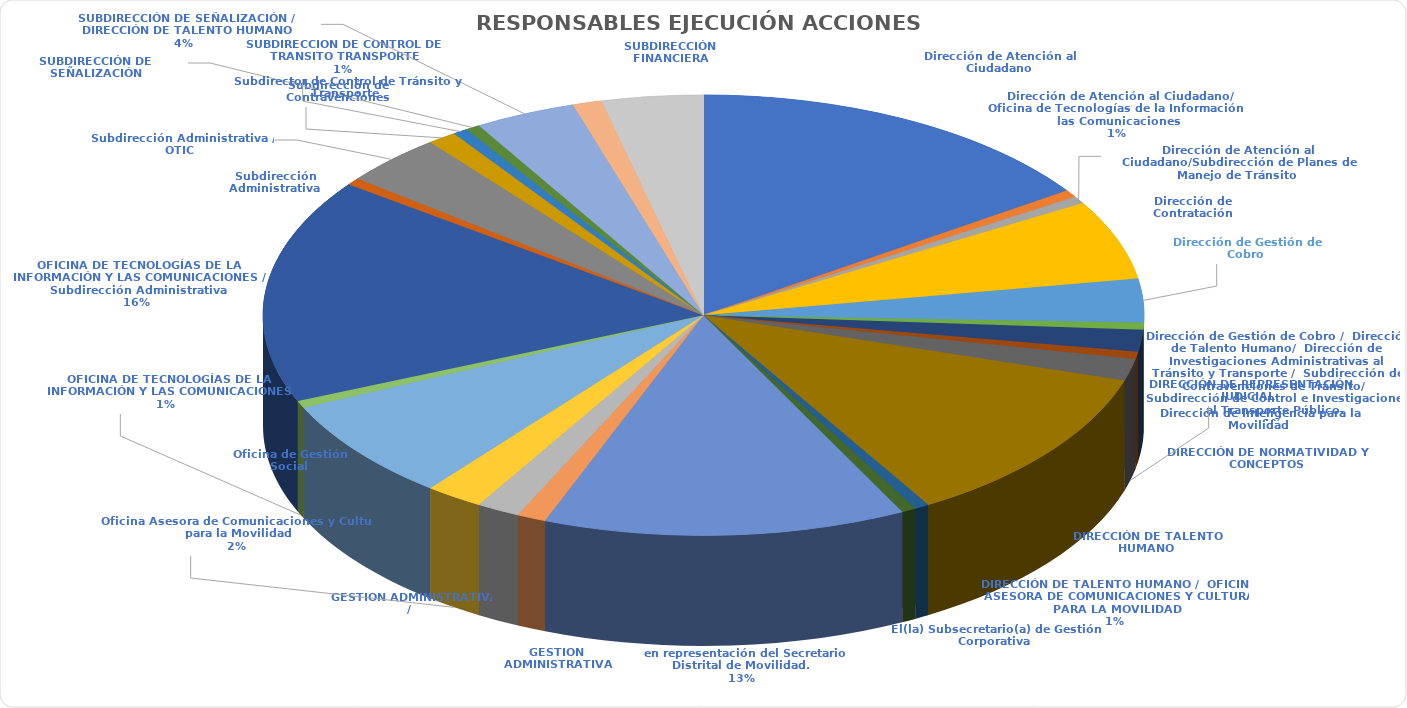
| Category | Total |
|---|---|
| Dirección de Atención al Ciudadano | 29 |
| Dirección de Atención al Ciudadano/ Oficina de Tecnologías de la Información y las Comunicaciones | 1 |
| Dirección de Atención al Ciudadano/Subdirección de Planes de Manejo de Tránsito | 1 |
| Dirección de Contratación | 11 |
| Dirección de Gestión de Cobro | 6 |
| Dirección de Gestión de Cobro /  Dirección de Talento Humano/  Dirección de Investigaciones Administrativas al Tránsito y Transporte /  Subdirección de Contravenciones de Tránsito/  Subdirección de Control e Investigaciones al Transporte Público. | 1 |
| Dirección de Inteligencia para la Movilidad | 3 |
| DIRECCIÓN DE NORMATIVIDAD Y CONCEPTOS
 DIRECCIÓN DE TALENTO HUMANO | 1 |
| DIRECCIÓN DE REPRESENTACIÓN JUDICIAL | 3 |
| DIRECCIÓN DE TALENTO HUMANO | 22 |
| DIRECCIÓN DE TALENTO HUMANO /  OFICINA ASESORA DE COMUNICACIONES Y CULTURA PARA LA MOVILIDAD | 1 |
| El(la) Subsecretario(a) de Gestión Corporativa, en representación del Secretario Distrital de Movilidad. 
 El(la) Director(a) Administrativo(a) y Financiero(a). 
 El(la) Director (a) de Investigaciones Administrativas al Tránsito y Transporte. 
 El(la) Su | 1 |
| GESTION ADMINISTRATIVA | 25 |
| GESTION ADMINISTRATIVA / 
 SUBDIRECCION DE CONTROL DE TRANSITO TRANSPORTE | 2 |
| Oficina Asesora de Comunicaciones y Cultura para la Movilidad | 3 |
| Oficina de Gestión Social | 4 |
| OFICINA DE TECNOLOGÍAS DE LA INFORMACIÓN Y LAS COMUNICACIONES | 14 |
| OFICINA DE TECNOLOGÍAS DE LA INFORMACIÓN Y LAS COMUNICACIONES / Subdirección Administrativa | 1 |
| Subdirección Administrativa | 31 |
| Subdirección Administrativa / OTIC | 1 |
| Subdirección de Contravenciones | 7 |
| SUBDIRECCION DE CONTROL DE TRANSITO TRANSPORTE | 2 |
| SUBDIRECCIÓN DE SEÑALIZACIÓN | 1 |
| SUBDIRECCIÓN DE SEÑALIZACIÓN / DIRECCIÓN DE TALENTO HUMANO | 1 |
| SUBDIRECCIÓN FINANCIERA | 7 |
| Subdirector de Control de Tránsito y Transporte | 2 |
| Subsecretaria de Gestion Corporativa | 7 |